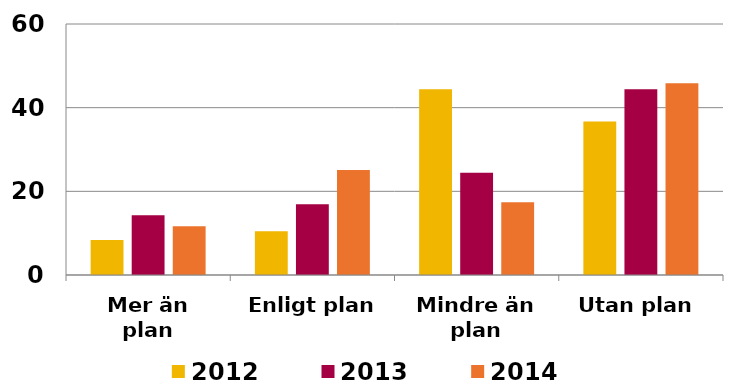
| Category | 2012 | 2013 | 2014 |
|---|---|---|---|
| Mer än plan | 8.365 | 14.303 | 11.676 |
| Enligt plan | 10.482 | 16.903 | 25.098 |
| Mindre än plan | 44.431 | 24.412 | 17.387 |
| Utan plan | 36.722 | 44.382 | 45.839 |